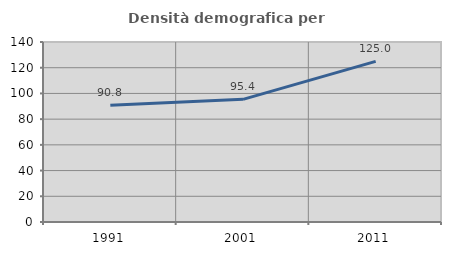
| Category | Densità demografica |
|---|---|
| 1991.0 | 90.774 |
| 2001.0 | 95.391 |
| 2011.0 | 124.973 |